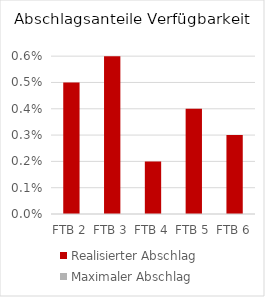
| Category | Realisierter Abschlag | Maximaler Abschlag |
|---|---|---|
| FTB 2 | 0.005 | 0 |
| FTB 3 | 0.006 | 0 |
| FTB 4 | 0.002 | 0 |
| FTB 5 | 0.004 | 0 |
| FTB 6 | 0.003 | 0 |